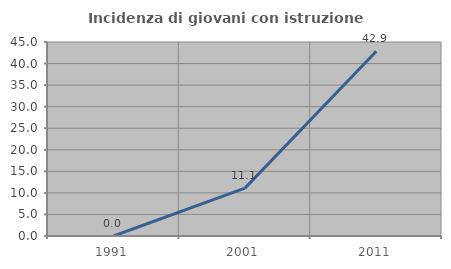
| Category | Incidenza di giovani con istruzione universitaria |
|---|---|
| 1991.0 | 0 |
| 2001.0 | 11.111 |
| 2011.0 | 42.857 |